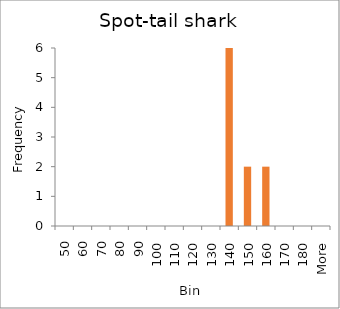
| Category | Frequency |
|---|---|
| 50 | 0 |
| 60 | 0 |
| 70 | 0 |
| 80 | 0 |
| 90 | 0 |
| 100 | 0 |
| 110 | 0 |
| 120 | 0 |
| 130 | 0 |
| 140 | 6 |
| 150 | 2 |
| 160 | 2 |
| 170 | 0 |
| 180 | 0 |
| More | 0 |